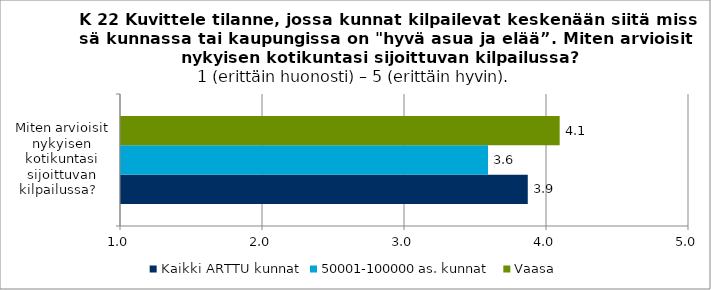
| Category | Kaikki ARTTU kunnat | 50001-100000 as. kunnat | Vaasa |
|---|---|---|---|
| Miten arvioisit nykyisen kotikuntasi sijoittuvan kilpailussa?   | 3.865 | 3.585 | 4.089 |